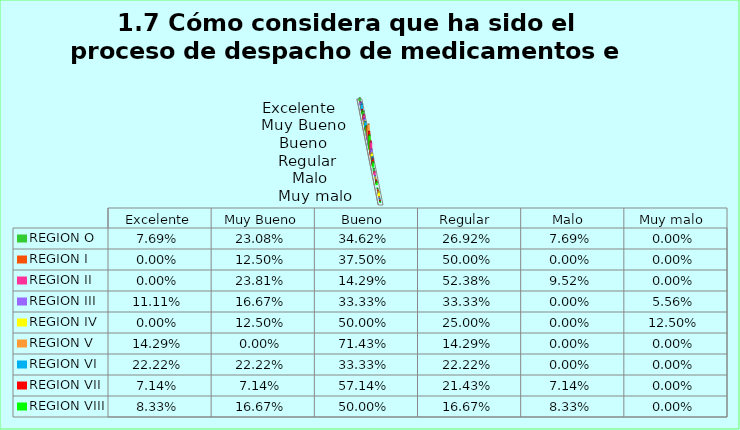
| Category | REGION O | REGION I  | REGION II | REGION III | REGION IV | REGION V  | REGION VI  | REGION VII  | REGION VIII |
|---|---|---|---|---|---|---|---|---|---|
| Excelente | 0.077 | 0 | 0 | 0.111 | 0 | 0.143 | 0.222 | 0.071 | 0.083 |
| Muy Bueno | 0.231 | 0.125 | 0.238 | 0.167 | 0.125 | 0 | 0.222 | 0.071 | 0.167 |
| Bueno  | 0.346 | 0.375 | 0.143 | 0.333 | 0.5 | 0.714 | 0.333 | 0.571 | 0.5 |
| Regular  | 0.269 | 0.5 | 0.524 | 0.333 | 0.25 | 0.143 | 0.222 | 0.214 | 0.167 |
| Malo  | 0.077 | 0 | 0.095 | 0 | 0 | 0 | 0 | 0.071 | 0.083 |
| Muy malo  | 0 | 0 | 0 | 0.056 | 0.125 | 0 | 0 | 0 | 0 |